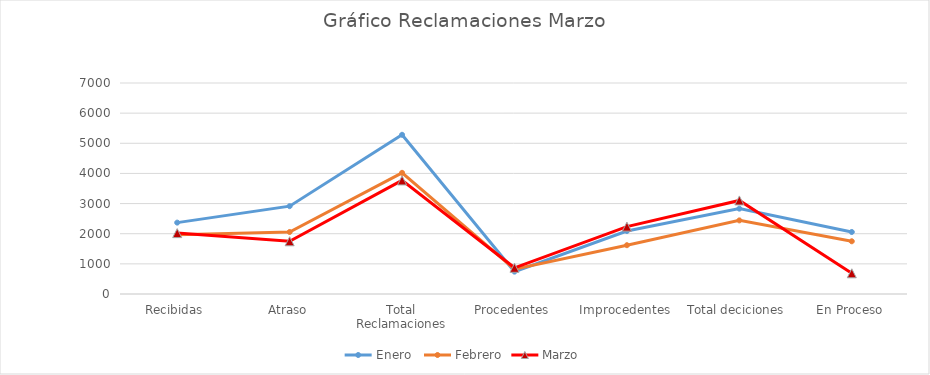
| Category | Enero  | Febrero | Marzo |
|---|---|---|---|
| Recibidas | 2368 | 1963 | 2020 |
| Atraso | 2914 | 2057 | 1749 |
| Total Reclamaciones | 5282 | 4020 | 3769 |
| Procedentes | 742 | 823 | 869 |
| Improcedentes | 2090 | 1619 | 2235 |
| Total deciciones | 2832 | 2442 | 3104 |
| En Proceso | 2057 | 1749 | 687 |